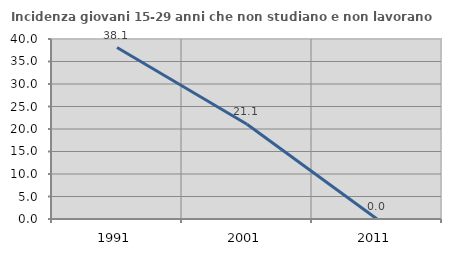
| Category | Incidenza giovani 15-29 anni che non studiano e non lavorano  |
|---|---|
| 1991.0 | 38.095 |
| 2001.0 | 21.053 |
| 2011.0 | 0 |